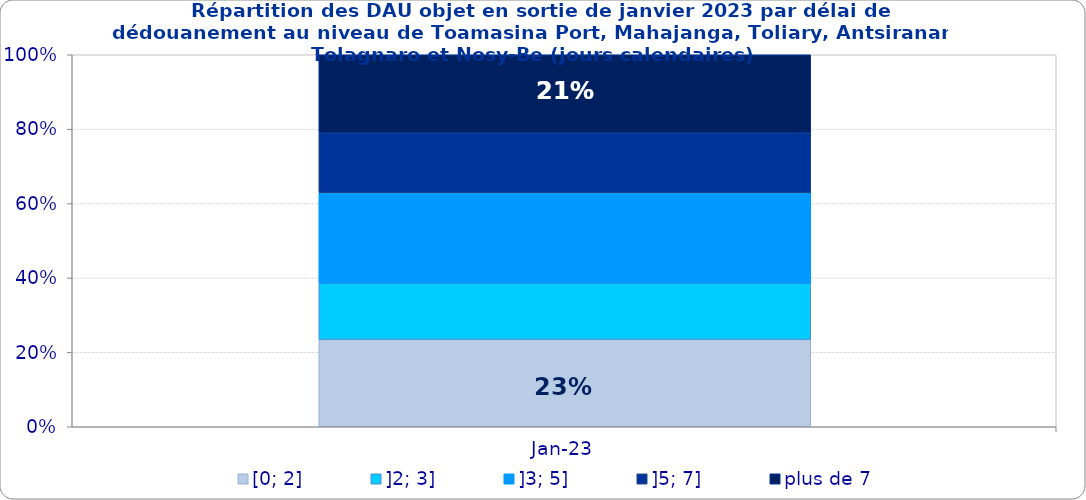
| Category | [0; 2] | ]2; 3] | ]3; 5] | ]5; 7] | plus de 7 |
|---|---|---|---|---|---|
| 2023-01-01 | 0.235 | 0.151 | 0.244 | 0.161 | 0.21 |